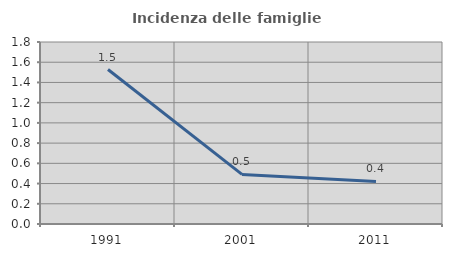
| Category | Incidenza delle famiglie numerose |
|---|---|
| 1991.0 | 1.528 |
| 2001.0 | 0.491 |
| 2011.0 | 0.421 |